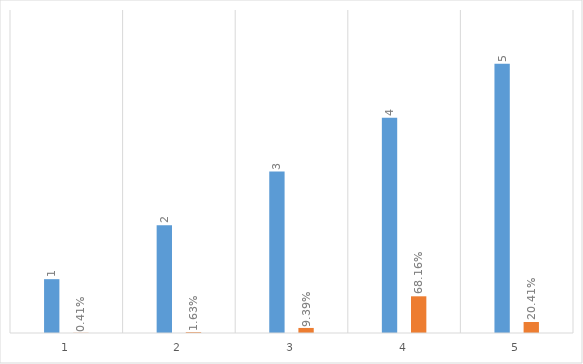
| Category | Series 0 | Series 1 |
|---|---|---|
| 0 | 1 | 0.004 |
| 1 | 2 | 0.016 |
| 2 | 3 | 0.094 |
| 3 | 4 | 0.682 |
| 4 | 5 | 0.204 |